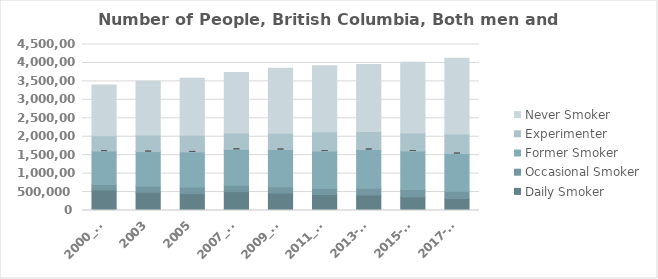
| Category | Daily Smoker | Occasional Smoker | Former Smoker | Experimenter | Never Smoker |
|---|---|---|---|---|---|
| 2000_01 | 554700 | 148100 | 907200 | 414900 | 1374500 |
| 2003 | 492900 | 167200 | 937100 | 451500 | 1457200 |
| 2005 | 454400 | 185000 | 948700 | 449000 | 1550200 |
| 2007_08 | 512100 | 171700 | 974700 | 444400 | 1635200 |
| 2009_10 | 474500 | 171400 | 1006300 | 444500 | 1760400 |
| 2011_12 | 434400 | 159000 | 1018200 | 524700 | 1785600 |
| 2013-14 | 419200 | 185300 | 1049000 | 487100 | 1818100 |
| 2015-16 | 367400 | 200700 | 1044900 | 487600 | 1920100 |
| 2017-18 | 326700 | 192200 | 1025300 | 531800 | 2053300 |